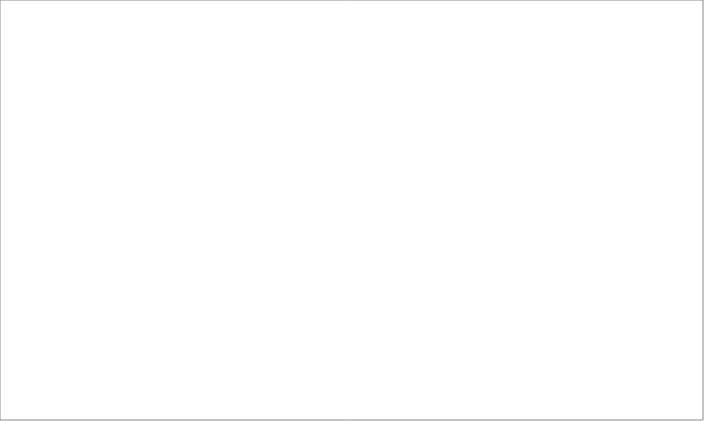
| Category | 2004 | 2005 | 2006 | 2008 | 2009 | 2010 | 2011 | 2012 | 2013 |
|---|---|---|---|---|---|---|---|---|---|
| mazowieckie | 116 | 130 | 171 | 78 | 77 | 53 | 63 | 64 | 69 |